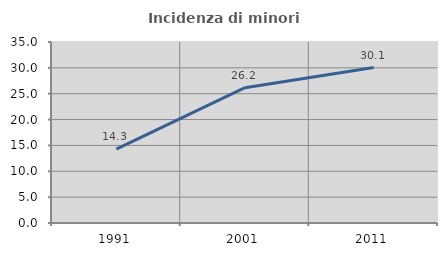
| Category | Incidenza di minori stranieri |
|---|---|
| 1991.0 | 14.286 |
| 2001.0 | 26.158 |
| 2011.0 | 30.059 |